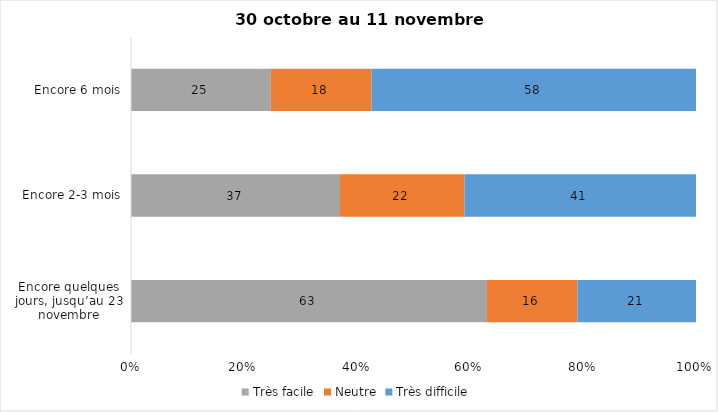
| Category | Très facile | Neutre | Très difficile |
|---|---|---|---|
| Encore quelques jours, jusqu’au 23 novembre | 63 | 16 | 21 |
| Encore 2-3 mois | 37 | 22 | 41 |
| Encore 6 mois | 25 | 18 | 58 |